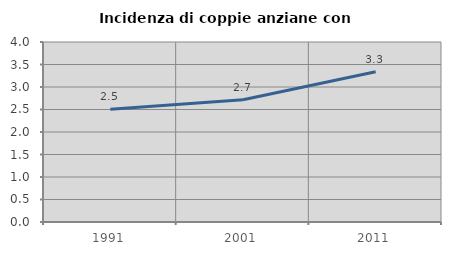
| Category | Incidenza di coppie anziane con figli |
|---|---|
| 1991.0 | 2.508 |
| 2001.0 | 2.716 |
| 2011.0 | 3.339 |